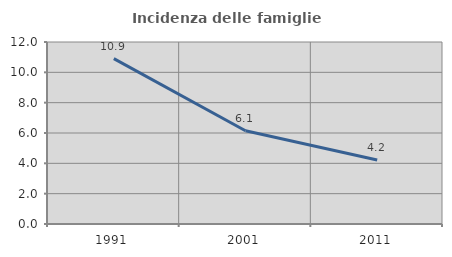
| Category | Incidenza delle famiglie numerose |
|---|---|
| 1991.0 | 10.904 |
| 2001.0 | 6.148 |
| 2011.0 | 4.223 |